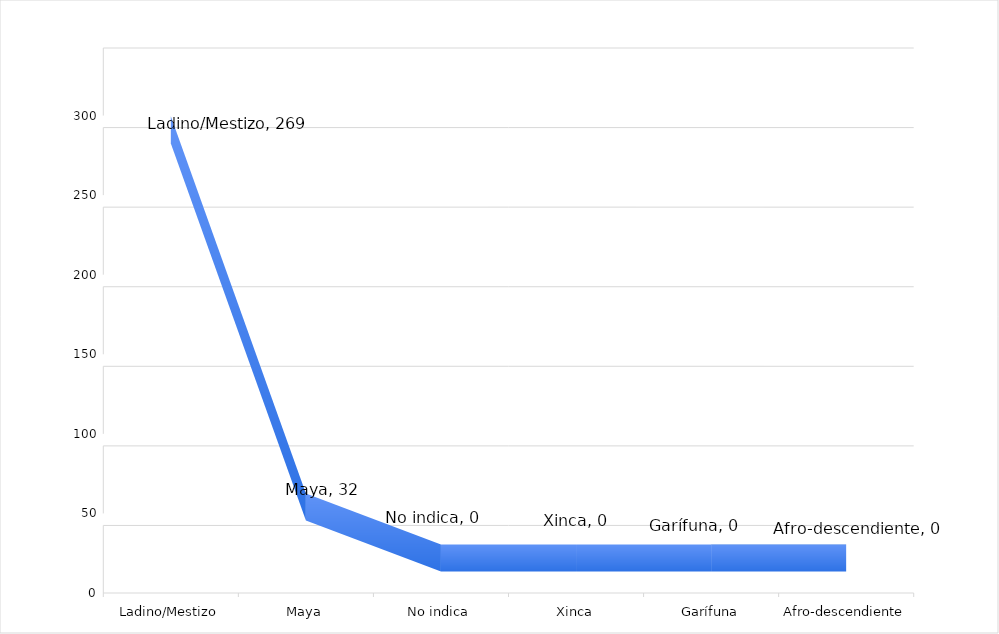
| Category | Series 0 |
|---|---|
| Ladino/Mestizo | 269 |
| Maya | 32 |
| No indica | 0 |
| Xinca | 0 |
| Garífuna | 0 |
| Afro-descendiente | 0 |